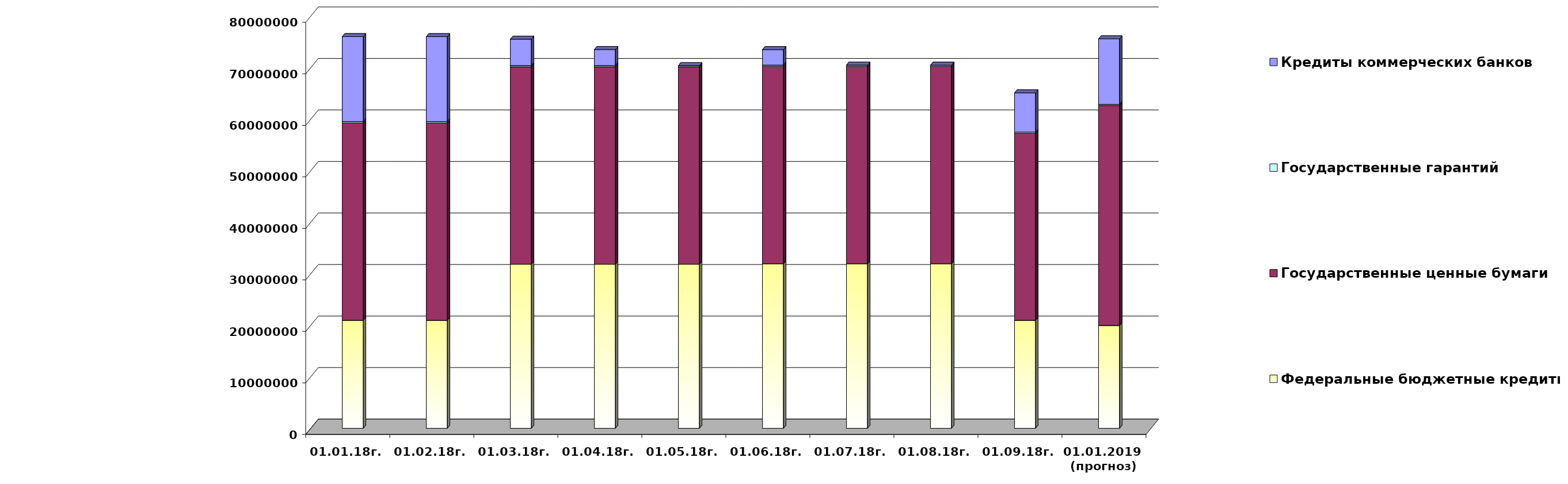
| Category | Федеральные бюджетные кредиты | Государственные ценные бумаги  | Государственные гарантий | Кредиты коммерческих банков |
|---|---|---|---|---|
| 01.01.18г. | 20959084.963 | 38300000 | 267412.82 | 16500000 |
| 01.02.18г. | 20959084.963 | 38300000 | 262100.52 | 16500000 |
| 01.03.18г. | 31846902.963 | 38300000 | 262100.52 | 5112182 |
| 01.04.18г. | 31846902.963 | 38300000 | 262100.52 | 3112182 |
| 01.05.18г. | 31846902.963 | 38300000 | 253223.16 | 0 |
| 01.06.18г. | 31945227.963 | 38300000 | 253223.16 | 3000000 |
| 01.07.18г. | 31945227.963 | 38300000 | 253223.16 | 0 |
| 01.08.18г. | 31945227.963 | 38300000 | 232477.01 | 0 |
| 01.09.18г. | 20959084.963 | 36300000 | 232477.01 | 7612182 |
| 01.01.2019 
(прогноз) | 19957026.2 | 42700000 | 209872.8 | 12725037.2 |